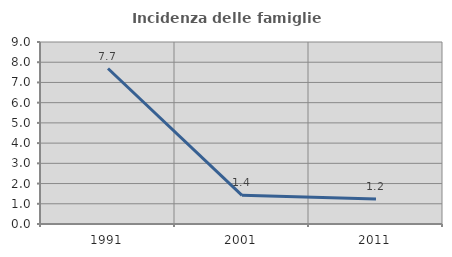
| Category | Incidenza delle famiglie numerose |
|---|---|
| 1991.0 | 7.689 |
| 2001.0 | 1.418 |
| 2011.0 | 1.24 |